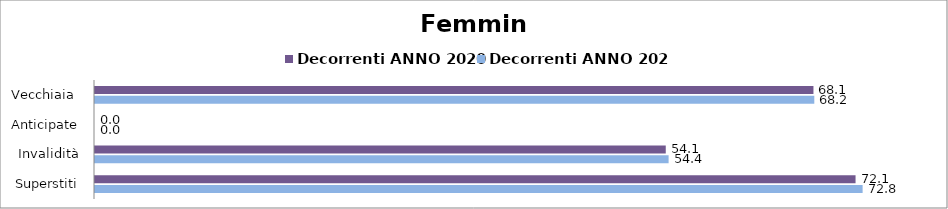
| Category | Decorrenti ANNO 2020 | Decorrenti ANNO 2021 |
|---|---|---|
| Vecchiaia  | 68.1 | 68.18 |
| Anticipate | 0 | 0 |
| Invalidità | 54.1 | 54.37 |
| Superstiti | 72.09 | 72.76 |